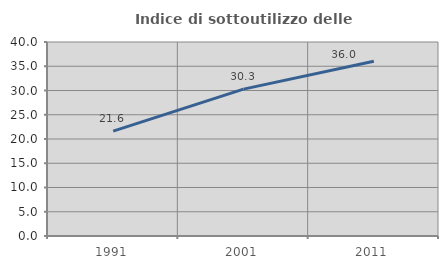
| Category | Indice di sottoutilizzo delle abitazioni  |
|---|---|
| 1991.0 | 21.622 |
| 2001.0 | 30.288 |
| 2011.0 | 36.036 |